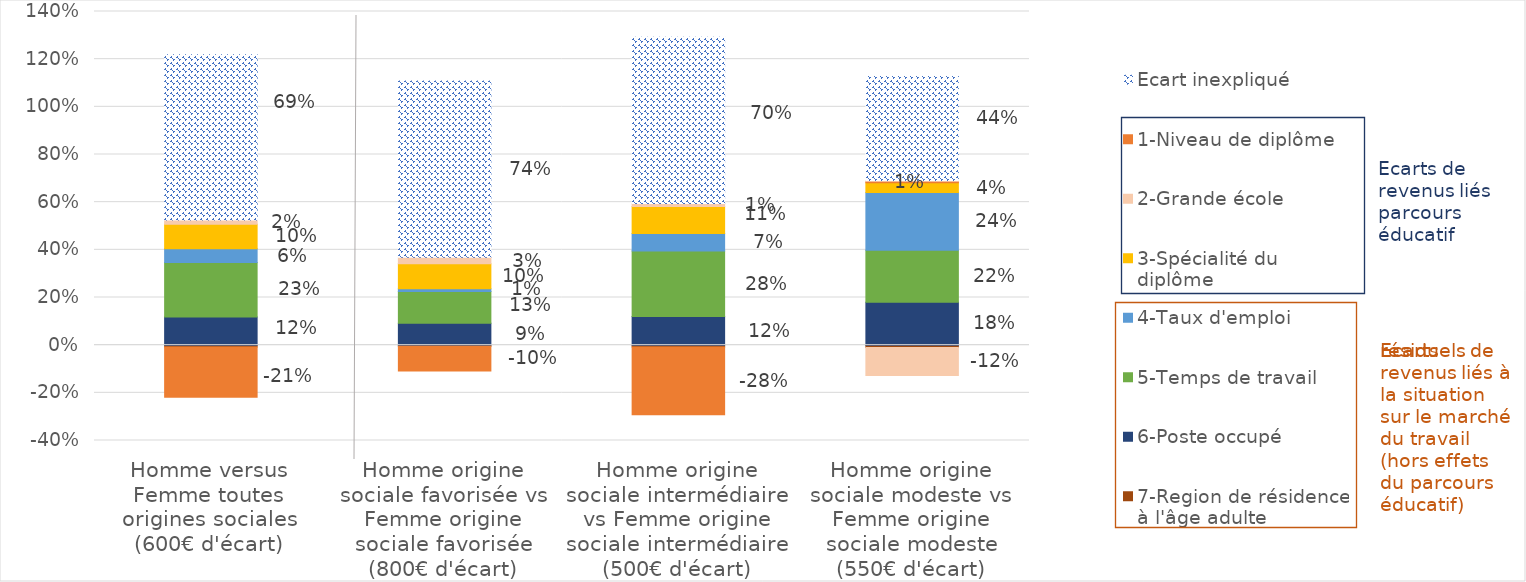
| Category | 7-Region de résidence à l'âge adulte | 6-Poste occupé | 5-Temps de travail | 4-Taux d'emploi | 3-Spécialité du diplôme | 2-Grande école | 1-Niveau de diplôme | Ecart inexpliqué |
|---|---|---|---|---|---|---|---|---|
| Homme versus Femme toutes origines sociales (600€ d'écart) | -0.007 | 0.118 | 0.229 | 0.058 | 0.103 | 0.018 | -0.211 | 0.693 |
| Homme origine sociale favorisée vs Femme origine sociale favorisée (800€ d'écart) | -0.005 | 0.091 | 0.134 | 0.012 | 0.104 | 0.028 | -0.103 | 0.739 |
| Homme origine sociale intermédiaire vs Femme origine sociale intermédiaire (500€ d'écart) | -0.008 | 0.12 | 0.275 | 0.073 | 0.114 | 0.012 | -0.284 | 0.698 |
| Homme origine sociale modeste vs Femme origine sociale modeste (550€ d'écart) | -0.01 | 0.18 | 0.218 | 0.242 | 0.041 | -0.117 | 0.008 | 0.437 |